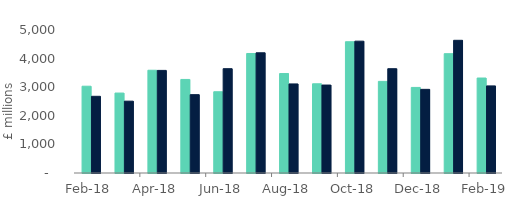
| Category | Full market | Remortgage without equity withdrawn |
|---|---|---|
| 2018-02-01 | 3034.826 | 2681.435 |
| 2018-03-01 | 2795.306 | 2511.578 |
| 2018-04-01 | 3593.095 | 3587.346 |
| 2018-05-01 | 3270.978 | 2739.139 |
| 2018-06-01 | 2841.037 | 3647.702 |
| 2018-07-01 | 4178.66 | 4203.083 |
| 2018-08-01 | 3477.397 | 3115 |
| 2018-09-01 | 3119.095 | 3074.943 |
| 2018-10-01 | 4590.165 | 4609.443 |
| 2018-11-01 | 3203.354 | 3646.906 |
| 2018-12-01 | 2991.752 | 2924.717 |
| 2019-01-01 | 4171.91 | 4639.71 |
| 2019-02-01 | 3320.944 | 3046.238 |